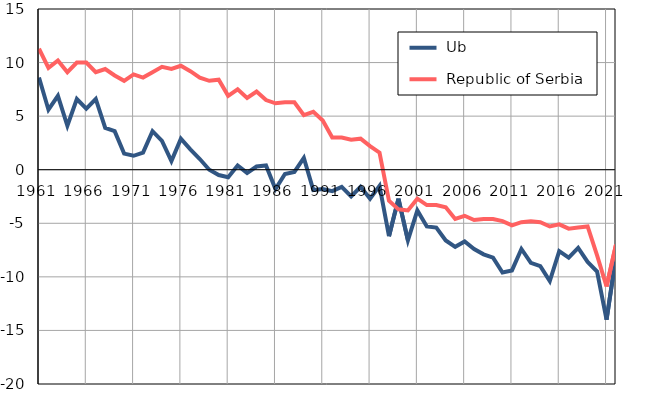
| Category |  Ub |  Republic of Serbia |
|---|---|---|
| 1961.0 | 8.6 | 11.3 |
| 1962.0 | 5.6 | 9.5 |
| 1963.0 | 6.9 | 10.2 |
| 1964.0 | 4.1 | 9.1 |
| 1965.0 | 6.6 | 10 |
| 1966.0 | 5.7 | 10 |
| 1967.0 | 6.6 | 9.1 |
| 1968.0 | 3.9 | 9.4 |
| 1969.0 | 3.6 | 8.8 |
| 1970.0 | 1.5 | 8.3 |
| 1971.0 | 1.3 | 8.9 |
| 1972.0 | 1.6 | 8.6 |
| 1973.0 | 3.6 | 9.1 |
| 1974.0 | 2.7 | 9.6 |
| 1975.0 | 0.8 | 9.4 |
| 1976.0 | 2.9 | 9.7 |
| 1977.0 | 1.9 | 9.2 |
| 1978.0 | 1 | 8.6 |
| 1979.0 | 0 | 8.3 |
| 1980.0 | -0.5 | 8.4 |
| 1981.0 | -0.7 | 6.9 |
| 1982.0 | 0.4 | 7.5 |
| 1983.0 | -0.3 | 6.7 |
| 1984.0 | 0.3 | 7.3 |
| 1985.0 | 0.4 | 6.5 |
| 1986.0 | -1.8 | 6.2 |
| 1987.0 | -0.4 | 6.3 |
| 1988.0 | -0.2 | 6.3 |
| 1989.0 | 1.1 | 5.1 |
| 1990.0 | -1.9 | 5.4 |
| 1991.0 | -1.8 | 4.6 |
| 1992.0 | -2 | 3 |
| 1993.0 | -1.6 | 3 |
| 1994.0 | -2.5 | 2.8 |
| 1995.0 | -1.6 | 2.9 |
| 1996.0 | -2.7 | 2.2 |
| 1997.0 | -1.5 | 1.6 |
| 1998.0 | -6.2 | -2.9 |
| 1999.0 | -2.7 | -3.7 |
| 2000.0 | -6.6 | -3.8 |
| 2001.0 | -3.8 | -2.7 |
| 2002.0 | -5.3 | -3.3 |
| 2003.0 | -5.4 | -3.3 |
| 2004.0 | -6.6 | -3.5 |
| 2005.0 | -7.2 | -4.6 |
| 2006.0 | -6.7 | -4.3 |
| 2007.0 | -7.4 | -4.7 |
| 2008.0 | -7.9 | -4.6 |
| 2009.0 | -8.2 | -4.6 |
| 2010.0 | -9.6 | -4.8 |
| 2011.0 | -9.4 | -5.2 |
| 2012.0 | -7.4 | -4.9 |
| 2013.0 | -8.7 | -4.8 |
| 2014.0 | -9 | -4.9 |
| 2015.0 | -10.4 | -5.3 |
| 2016.0 | -7.6 | -5.1 |
| 2017.0 | -8.2 | -5.5 |
| 2018.0 | -7.3 | -5.4 |
| 2019.0 | -8.6 | -5.3 |
| 2020.0 | -9.5 | -8 |
| 2021.0 | -14 | -10.9 |
| 2022.0 | -8.1 | -7 |